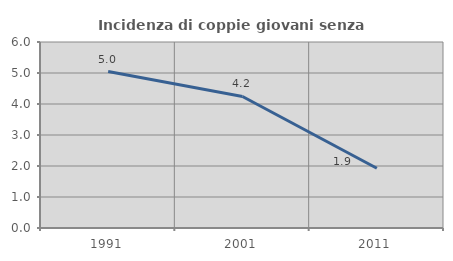
| Category | Incidenza di coppie giovani senza figli |
|---|---|
| 1991.0 | 5.046 |
| 2001.0 | 4.244 |
| 2011.0 | 1.929 |